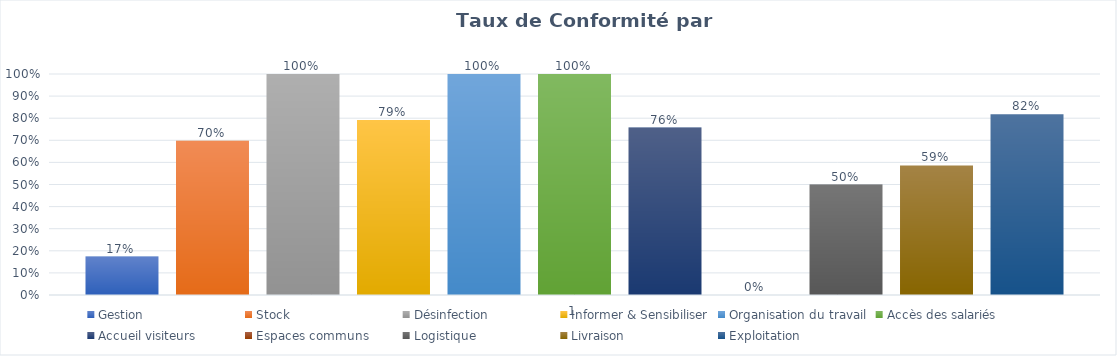
| Category | Gestion | Stock | Désinfection | Informer & Sensibiliser | Organisation du travail | Accès des salariés | Accueil visiteurs | Espaces communs | Logistique | Livraison | Exploitation |
|---|---|---|---|---|---|---|---|---|---|---|---|
| 0 | 0.174 | 0.698 | 1 | 0.792 | 1 | 1 | 0.758 | 0 | 0.5 | 0.586 | 0.818 |